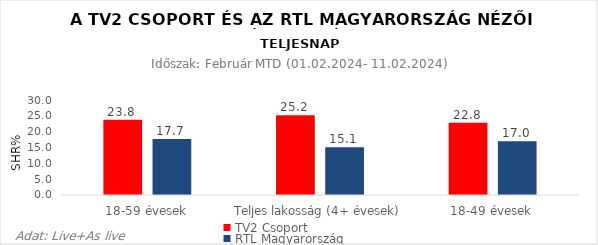
| Category | TV2 Csoport | RTL Magyarország |
|---|---|---|
| 18-59 évesek | 23.8 | 17.7 |
| Teljes lakosság (4+ évesek) | 25.2 | 15.1 |
| 18-49 évesek | 22.8 | 17 |